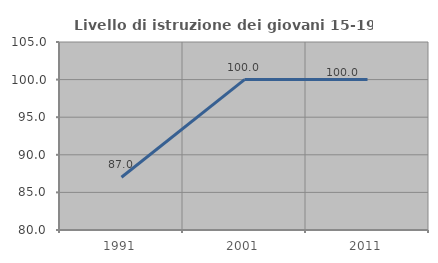
| Category | Livello di istruzione dei giovani 15-19 anni |
|---|---|
| 1991.0 | 87.013 |
| 2001.0 | 100 |
| 2011.0 | 100 |